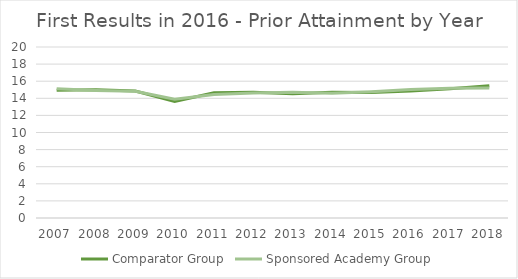
| Category | Comparator Group | Sponsored Academy Group |
|---|---|---|
| 2007.0 | 14.929 | 15.107 |
| 2008.0 | 15.005 | 14.916 |
| 2009.0 | 14.855 | 14.816 |
| 2010.0 | 13.634 | 13.903 |
| 2011.0 | 14.636 | 14.44 |
| 2012.0 | 14.707 | 14.615 |
| 2013.0 | 14.541 | 14.718 |
| 2014.0 | 14.706 | 14.583 |
| 2015.0 | 14.687 | 14.773 |
| 2016.0 | 14.844 | 15.042 |
| 2017.0 | 15.127 | 15.17 |
| 2018.0 | 15.457 | 15.197 |